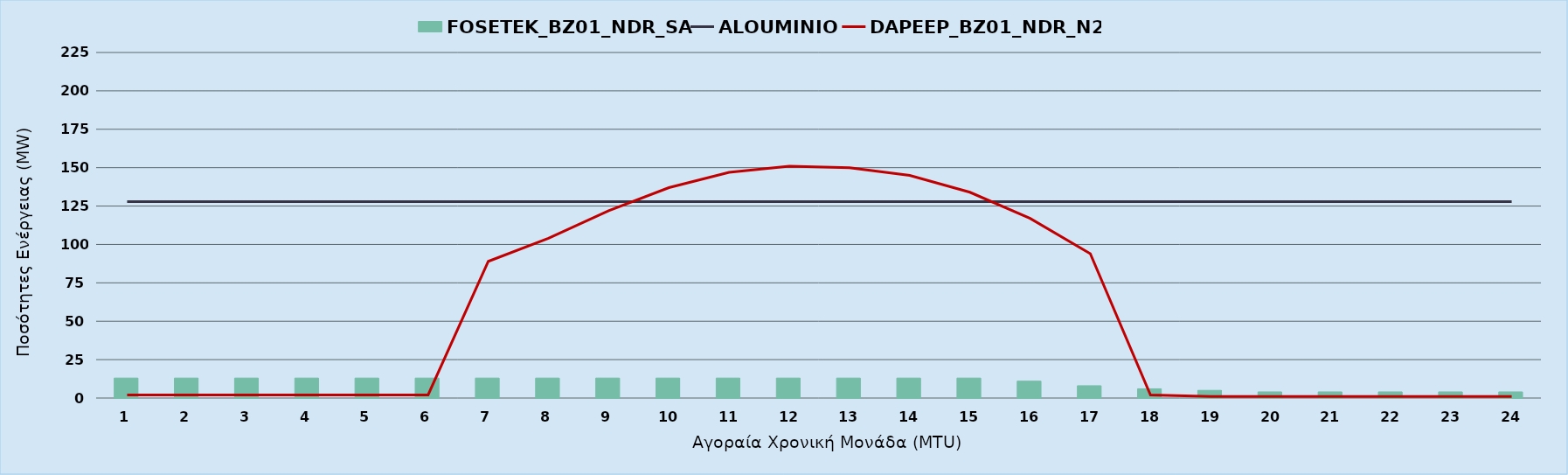
| Category | FOSETEK_BZ01_NDR_SA |
|---|---|
| 0 | 13 |
| 1 | 13 |
| 2 | 13 |
| 3 | 13 |
| 4 | 13 |
| 5 | 13 |
| 6 | 13 |
| 7 | 13 |
| 8 | 13 |
| 9 | 13 |
| 10 | 13 |
| 11 | 13 |
| 12 | 13 |
| 13 | 13 |
| 14 | 13 |
| 15 | 11 |
| 16 | 8 |
| 17 | 6 |
| 18 | 5 |
| 19 | 4 |
| 20 | 4 |
| 21 | 4 |
| 22 | 4 |
| 23 | 4 |